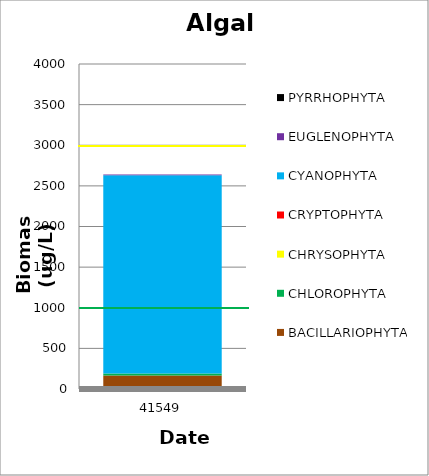
| Category | BACILLARIOPHYTA | CHLOROPHYTA | CHRYSOPHYTA | CRYPTOPHYTA | CYANOPHYTA | EUGLENOPHYTA | PYRRHOPHYTA |
|---|---|---|---|---|---|---|---|
| 41549.0 | 166.5 | 25.2 | 0 | 0 | 2438.1 | 9 | 0 |